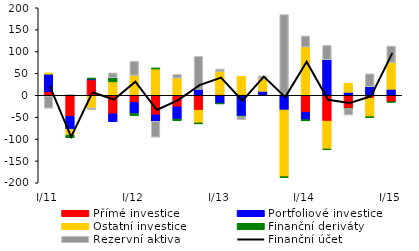
| Category | Přímé investice | Portfoliové investice | Ostatní investice | Finanční deriváty | Rezervní aktiva |
|---|---|---|---|---|---|
| I/11 | 8.394 | 39.909 | 2.964 | -2.567 | -26.789 |
| II | -48.128 | -29.388 | -13.604 | -5.635 | 2.123 |
| III | 35.202 | 1.853 | -28.649 | 2.491 | -3.698 |
| IV | -42.273 | -18.154 | 30.668 | 9.385 | 11.134 |
| I/12 | -16.29 | -25.293 | 45.36 | -4.87 | 32.632 |
| II | -44.641 | -14.957 | 60.168 | 2.453 | -35.982 |
| III | -26.334 | -28.062 | 39.368 | -3.806 | 8.321 |
| IV | -33.997 | 13.465 | -28.955 | -2.395 | 75.502 |
| I/13 | 1.859 | -18.95 | 52.574 | -0.086 | 5.61 |
| II | 1.859 | -47.44 | 41.851 | -1.44 | -6.912 |
| III | 1.859 | 7.148 | 28.263 | -1.061 | 6.889 |
| IV | 1.859 | -33.596 | -152.434 | -2.15 | 182.604 |
| I/14 | -38.685 | -16.995 | 110.469 | -2.764 | 25.08 |
| II | -59.028 | 81.147 | -64.302 | -0.503 | 32.776 |
| III | -29.662 | 6.715 | 20.861 | -0.818 | -14.448 |
| IV | -6.258 | 19.403 | -42.777 | -1.962 | 29.714 |
| I/15 | -15.188 | 13.794 | 60.796 | -0.585 | 38.01 |